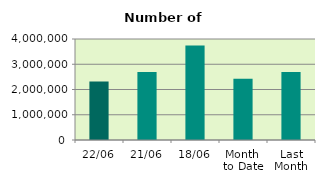
| Category | Series 0 |
|---|---|
| 22/06 | 2316746 |
| 21/06 | 2697070 |
| 18/06 | 3743478 |
| Month 
to Date | 2430405.5 |
| Last
Month | 2692139.333 |